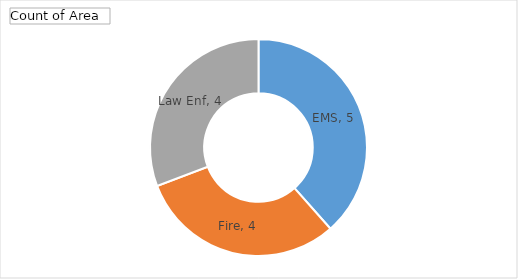
| Category | Total |
|---|---|
| EMS | 5 |
| Fire | 4 |
| Law Enf | 4 |